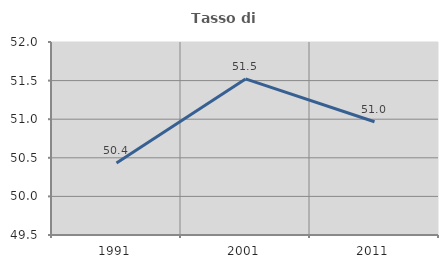
| Category | Tasso di occupazione   |
|---|---|
| 1991.0 | 50.434 |
| 2001.0 | 51.522 |
| 2011.0 | 50.967 |